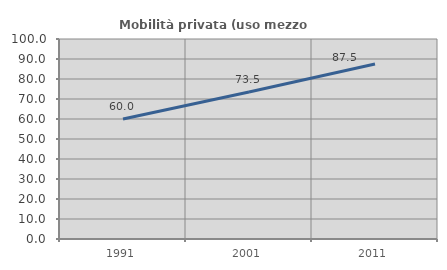
| Category | Mobilità privata (uso mezzo privato) |
|---|---|
| 1991.0 | 60 |
| 2001.0 | 73.529 |
| 2011.0 | 87.5 |